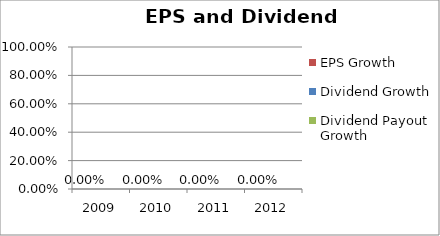
| Category | EPS Growth | Dividend Growth | Dividend Payout Growth |
|---|---|---|---|
| 2009.0 |  |  | 0 |
| 2010.0 |  |  | 0 |
| 2011.0 |  |  | 0 |
| 2012.0 |  |  | 0 |